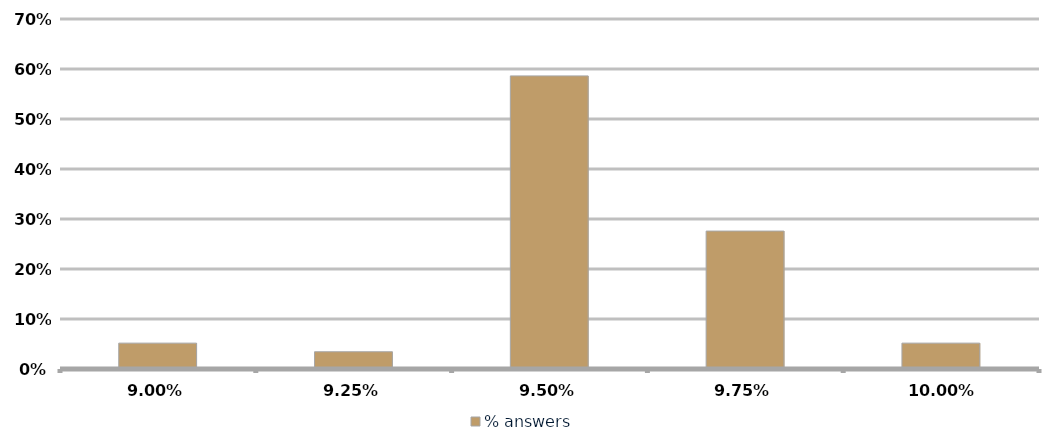
| Category | % answers |
|---|---|
| 0.09 | 0.052 |
| 0.0925 | 0.034 |
| 0.095 | 0.586 |
| 0.0975 | 0.276 |
| 0.1 | 0.052 |